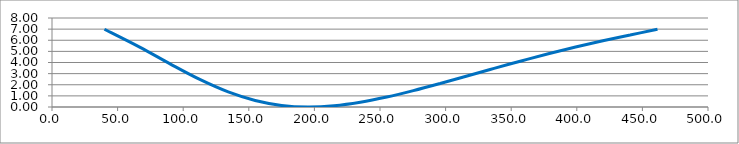
| Category | Series 0 |
|---|---|
| 39.9562 | 6.992 |
| 66.4696 | 5.406 |
| 90.6178 | 3.836 |
| 113.045 | 2.453 |
| 134.302 | 1.356 |
| 154.835 | 0.586 |
| 174.977 | 0.144 |
| 194.961 | 0 |
| 214.935 | 0.112 |
| 234.984 | 0.428 |
| 255.148 | 0.898 |
| 275.438 | 1.474 |
| 295.846 | 2.116 |
| 316.358 | 2.79 |
| 336.954 | 3.472 |
| 357.616 | 4.14 |
| 378.327 | 4.781 |
| 399.077 | 5.388 |
| 419.855 | 5.952 |
| 440.658 | 6.471 |
| 461.484 | 6.992 |